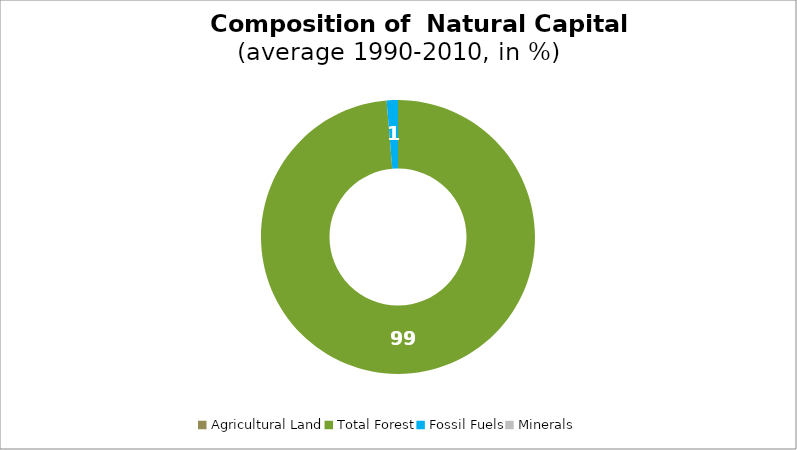
| Category | Series 0 |
|---|---|
| Agricultural Land | 0 |
| Total Forest | 98.67 |
| Fossil Fuels | 1.33 |
| Minerals | 0 |